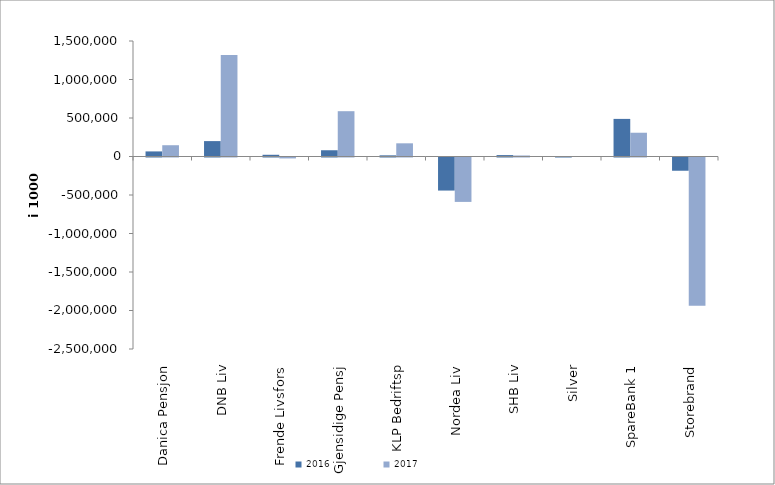
| Category | 2016 | 2017 |
|---|---|---|
| 0 | 66036.539 | 146462.129 |
| 1 | 200017 | 1318704 |
| 2 | 22327.125 | -12006 |
| 3 | 81229.822 | 588342 |
| 4 | 14951 | 171225 |
| 5 | -429389.115 | -576666.141 |
| 6 | 18281 | 13253 |
| 7 | -11 | 0 |
| 8 | 488344.013 | 308703.245 |
| 9 | -172015.207 | -1926593.096 |